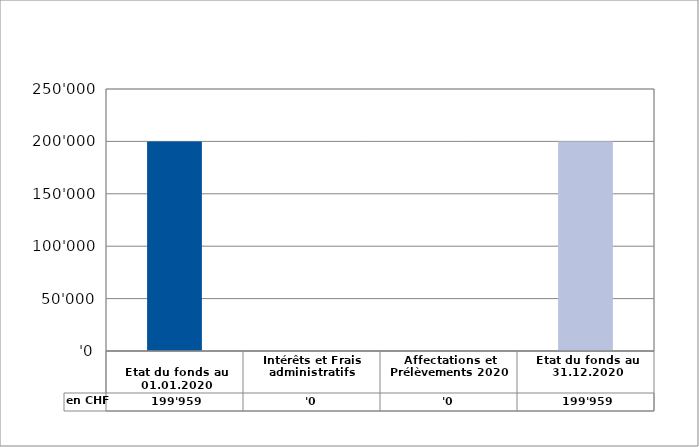
| Category | en CHF |
|---|---|
| 
Etat du fonds au 01.01.2020

 | 199959 |
| Intérêts et Frais administratifs | 0 |
| Affectations et Prélèvements 2020 | 0 |
| Etat du fonds au 31.12.2020 | 199959 |